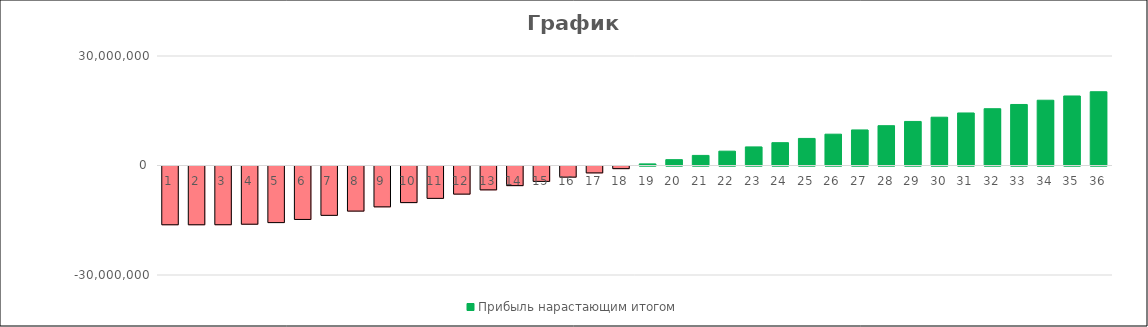
| Category | Прибыль нарастающим итогом |
|---|---|
| 0 | -16100288 |
| 1 | -16100288 |
| 2 | -16089429.337 |
| 3 | -15946822.573 |
| 4 | -15511058.961 |
| 5 | -14641147.247 |
| 6 | -13518913.669 |
| 7 | -12355845.108 |
| 8 | -11192776.547 |
| 9 | -10029707.986 |
| 10 | -8866639.425 |
| 11 | -7703570.864 |
| 12 | -6540502.303 |
| 13 | -5377433.742 |
| 14 | -4214365.181 |
| 15 | -3051296.62 |
| 16 | -1888228.059 |
| 17 | -725159.498 |
| 18 | 437909.063 |
| 19 | 1600977.624 |
| 20 | 2764046.185 |
| 21 | 3927114.746 |
| 22 | 5090183.307 |
| 23 | 6253251.868 |
| 24 | 7416320.429 |
| 25 | 8579388.99 |
| 26 | 9742457.551 |
| 27 | 10905526.112 |
| 28 | 12068594.673 |
| 29 | 13231663.234 |
| 30 | 14394731.795 |
| 31 | 15557800.356 |
| 32 | 16720868.917 |
| 33 | 17883937.478 |
| 34 | 19047006.039 |
| 35 | 20210074.6 |